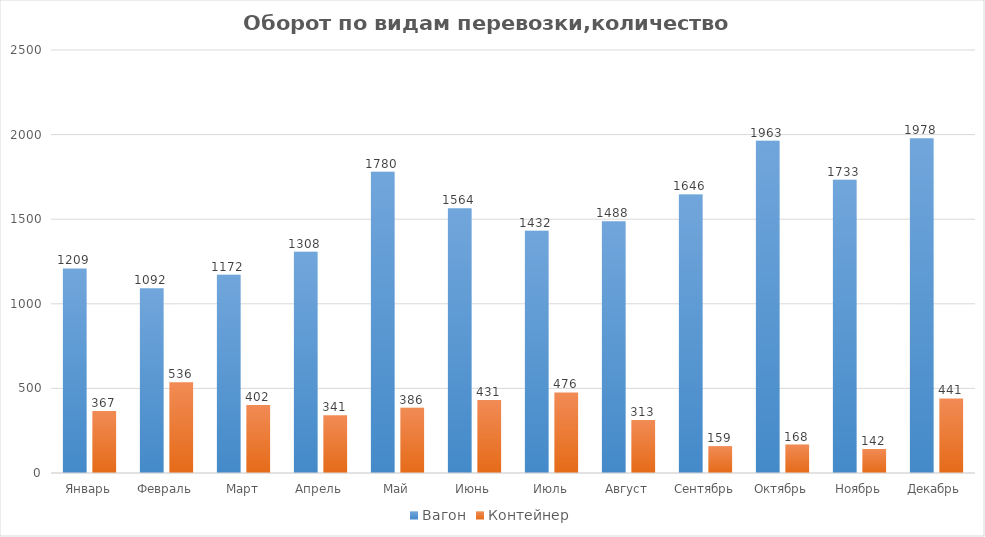
| Category | Вагон | Контейнер |
|---|---|---|
| Январь | 1209 | 367 |
| Февраль | 1092 | 536 |
| Март | 1172 | 402 |
| Апрель | 1308 | 341 |
| Май | 1780 | 386 |
| Июнь | 1564 | 431 |
| Июль | 1432 | 476 |
| Август | 1488 | 313 |
| Сентябрь | 1646 | 159 |
| Октябрь | 1963 | 168 |
| Ноябрь | 1733 | 142 |
| Декабрь | 1978 | 441 |